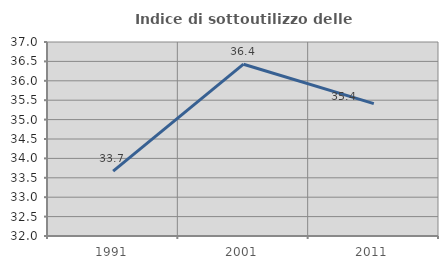
| Category | Indice di sottoutilizzo delle abitazioni  |
|---|---|
| 1991.0 | 33.67 |
| 2001.0 | 36.428 |
| 2011.0 | 35.412 |